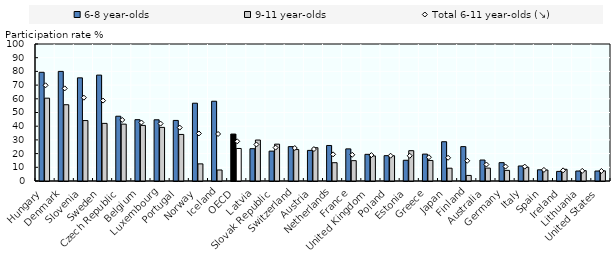
| Category | 6-8 year-olds | 9-11 year-olds |
|---|---|---|
| Hungary | 79.354 | 60.457 |
| Denmark | 80.002 | 55.67 |
| Slovenia | 75.296 | 44.123 |
| Sweden | 77.293 | 42.057 |
| Czech Republic | 47.275 | 41.504 |
| Belgium | 44.76 | 40.574 |
| Luxembourg | 44.678 | 39.142 |
| Portugal | 44.207 | 33.985 |
| Norway | 56.776 | 12.501 |
| Iceland | 58.213 | 8.04 |
| OECD | 34.267 | 23.741 |
| Latvia | 23.58 | 29.895 |
| Slovak Republic | 21.81 | 26.904 |
| Switzerland | 25.084 | 22.963 |
| Austria | 22.332 | 24.311 |
| Netherlands | 25.928 | 13.356 |
| France | 23.441 | 14.853 |
| United Kingdom | 19.465 | 18.297 |
| Poland | 18.492 | 18.433 |
| Estonia | 15.131 | 22.134 |
| Greece | 19.631 | 14.991 |
| Japan | 28.664 | 9.341 |
| Finland | 25.096 | 4.065 |
| Australia | 15.308 | 9.413 |
| Germany | 13.398 | 7.748 |
| Italy | 10.963 | 10.031 |
| Spain | 8.174 | 8.023 |
| Ireland | 7.003 | 8.54 |
| Lithuania | 7.28 | 7.54 |
| United States | 7.265 | 7.416 |